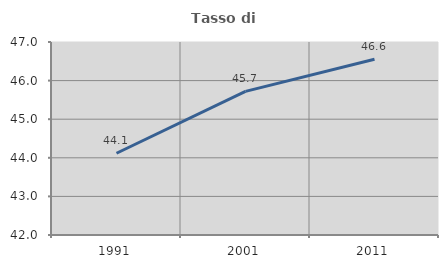
| Category | Tasso di occupazione   |
|---|---|
| 1991.0 | 44.118 |
| 2001.0 | 45.722 |
| 2011.0 | 46.555 |